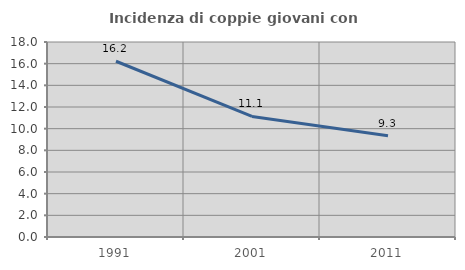
| Category | Incidenza di coppie giovani con figli |
|---|---|
| 1991.0 | 16.223 |
| 2001.0 | 11.126 |
| 2011.0 | 9.338 |